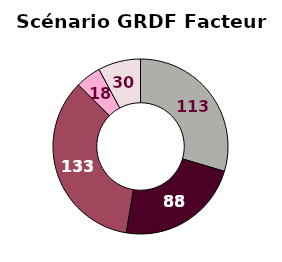
| Category | Scénario GrDF Facteur 4 |
|---|---|
| Gaz naturel | 113 |
| Biométhane 1G - Méthanisation | 88 |
| Biométhane 2G - Gazéification | 133 |
| Biométhane 3G - Microalgue | 18 |
| Hydrogène/Méthanation | 30 |